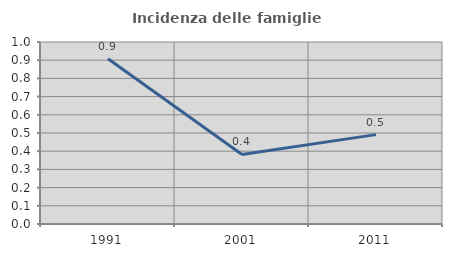
| Category | Incidenza delle famiglie numerose |
|---|---|
| 1991.0 | 0.908 |
| 2001.0 | 0.382 |
| 2011.0 | 0.491 |